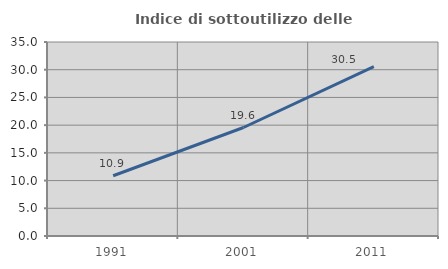
| Category | Indice di sottoutilizzo delle abitazioni  |
|---|---|
| 1991.0 | 10.87 |
| 2001.0 | 19.572 |
| 2011.0 | 30.546 |